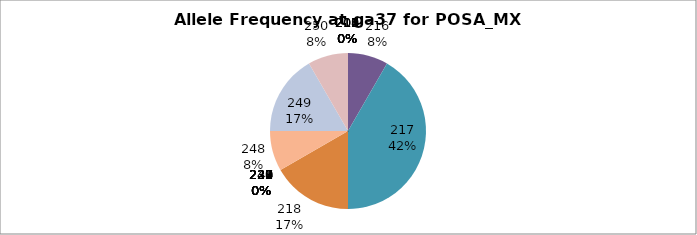
| Category | Series 0 |
|---|---|
| 207.0 | 0 |
| 208.0 | 0 |
| 209.0 | 0 |
| 210.0 | 0 |
| 211.0 | 0 |
| 212.0 | 0 |
| 213.0 | 0 |
| 214.0 | 0 |
| 215.0 | 0 |
| 216.0 | 0.083 |
| 217.0 | 0.417 |
| 218.0 | 0.167 |
| 226.0 | 0 |
| 227.0 | 0 |
| 228.0 | 0 |
| 229.0 | 0 |
| 230.0 | 0 |
| 231.0 | 0 |
| 232.0 | 0 |
| 234.0 | 0 |
| 239.0 | 0 |
| 240.0 | 0 |
| 247.0 | 0 |
| 248.0 | 0.083 |
| 249.0 | 0.167 |
| 250.0 | 0.083 |